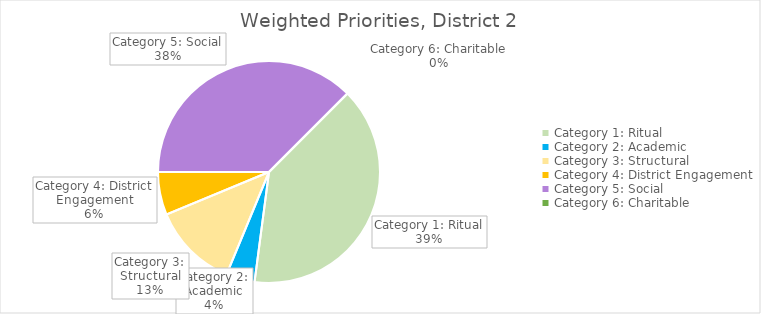
| Category | District 2 |
|---|---|
| Category 1: Ritual | 19 |
| Category 2: Academic | 2 |
| Category 3: Structural | 6 |
| Category 4: District Engagement | 3 |
| Category 5: Social | 18 |
| Category 6: Charitable | 0 |